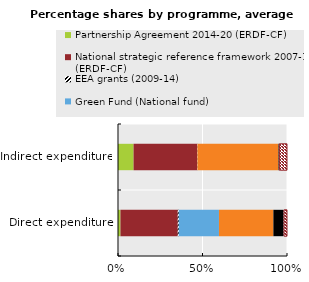
| Category | Partnership Agreement 2014-20 (ERDF-CF) | National strategic reference framework 2007-13 (ERDF-CF) | EEA grants (2009-14) | Green Fund (National fund) | Rural Development Programmes 2007-20 (EAFRD) | LIFE | Operational Programmes Fisheries 2007-20 (EMFF) |
|---|---|---|---|---|---|---|---|
| Direct expenditure | 3783715.437 | 88082130.798 | 1460350.31 | 61769567.403 | 83593528.567 | 15728559.195 | 5170650.932 |
| Indirect expenditure | 93041832.822 | 379750228.352 | 1461749.987 | 75257.962 | 483587954.258 | 3160387.193 | 48251189.632 |